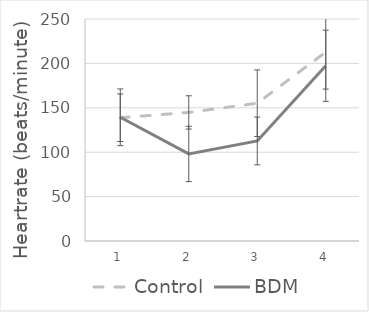
| Category | Control | BDM |
|---|---|---|
| 0 | 138.804 | 139.32 |
| 1 | 144.79 | 98.041 |
| 2 | 155.16 | 112.657 |
| 3 | 212.705 | 197.32 |